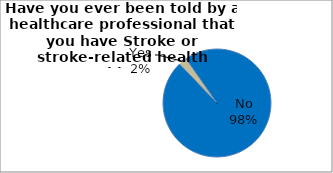
| Category | Series 0 |
|---|---|
| No | 97.522 |
| Yes | 2.478 |